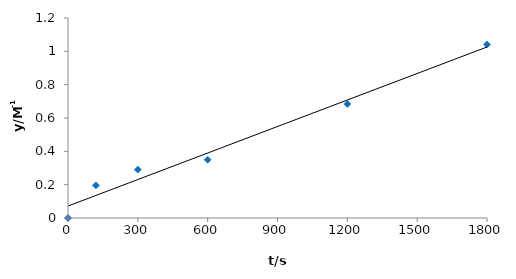
| Category | Series 0 |
|---|---|
| 0.0 | 0 |
| 120.0 | 0.196 |
| 300.0 | 0.29 |
| 600.0 | 0.35 |
| 1200.0 | 0.684 |
| 1800.0 | 1.041 |